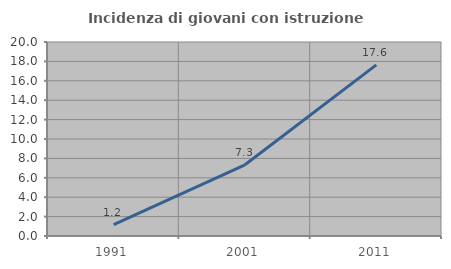
| Category | Incidenza di giovani con istruzione universitaria |
|---|---|
| 1991.0 | 1.176 |
| 2001.0 | 7.339 |
| 2011.0 | 17.647 |